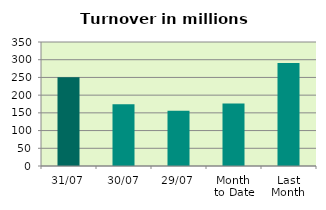
| Category | Series 0 |
|---|---|
| 31/07 | 250.285 |
| 30/07 | 173.997 |
| 29/07 | 155.832 |
| Month 
to Date | 176.477 |
| Last
Month | 290.981 |